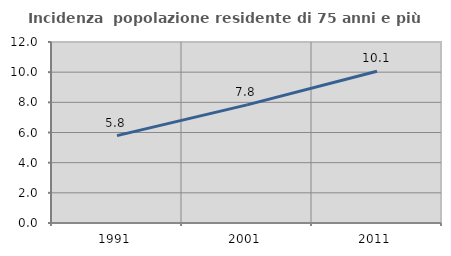
| Category | Incidenza  popolazione residente di 75 anni e più |
|---|---|
| 1991.0 | 5.792 |
| 2001.0 | 7.834 |
| 2011.0 | 10.056 |